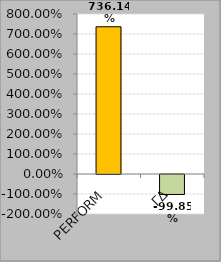
| Category | Series 0 |
|---|---|
| PERFORM | 7.361 |
| ΓΔ | -0.998 |